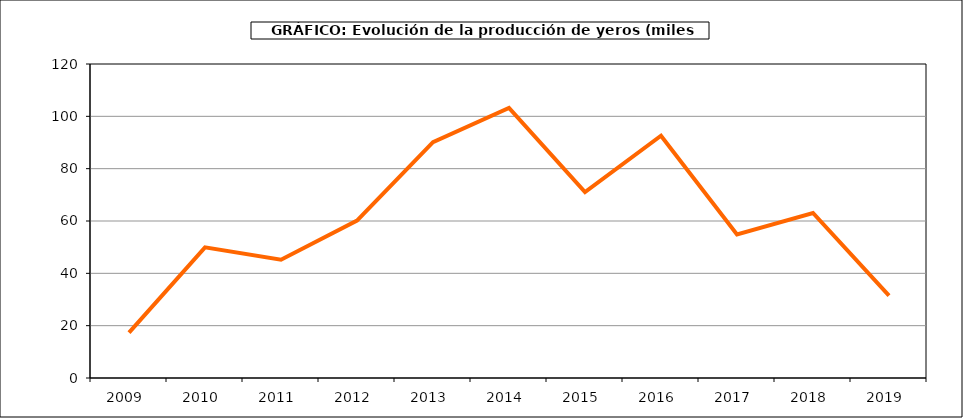
| Category | Producción |
|---|---|
| 2009.0 | 17.321 |
| 2010.0 | 49.937 |
| 2011.0 | 45.202 |
| 2012.0 | 60.147 |
| 2013.0 | 90.163 |
| 2014.0 | 103.242 |
| 2015.0 | 71.021 |
| 2016.0 | 92.587 |
| 2017.0 | 54.869 |
| 2018.0 | 63.055 |
| 2019.0 | 31.495 |